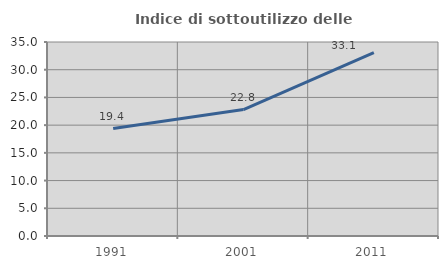
| Category | Indice di sottoutilizzo delle abitazioni  |
|---|---|
| 1991.0 | 19.381 |
| 2001.0 | 22.821 |
| 2011.0 | 33.074 |